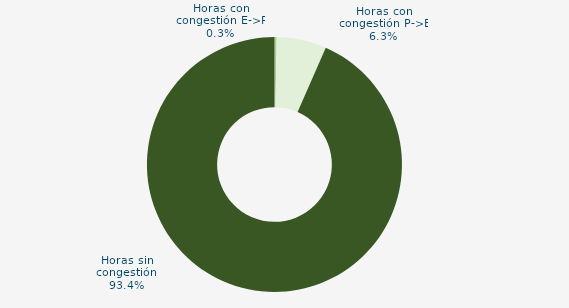
| Category | Horas con congestión E->P |
|---|---|
| Horas con congestión E->P | 0.269 |
| Horas con congestión P->E | 6.317 |
| Horas sin congestión | 93.414 |